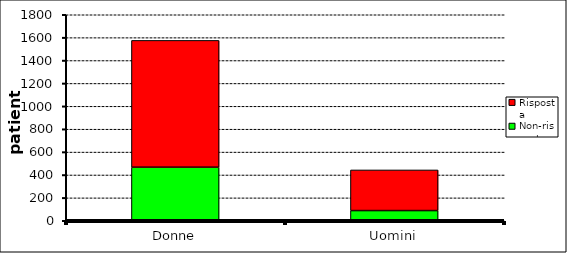
| Category | Non-risposta | Risposta |
|---|---|---|
| Donne | 468 | 1108 |
| Uomini | 89 | 355 |